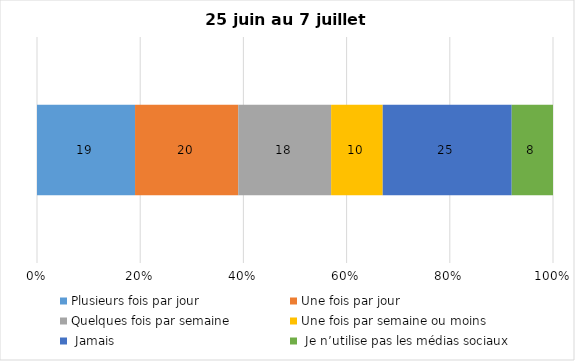
| Category | Plusieurs fois par jour | Une fois par jour | Quelques fois par semaine   | Une fois par semaine ou moins   |  Jamais   |  Je n’utilise pas les médias sociaux |
|---|---|---|---|---|---|---|
| 0 | 19 | 20 | 18 | 10 | 25 | 8 |